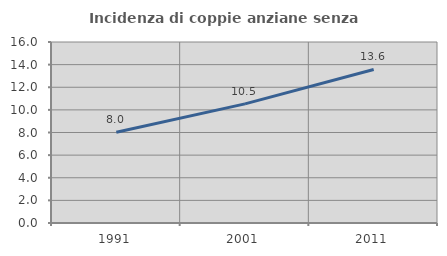
| Category | Incidenza di coppie anziane senza figli  |
|---|---|
| 1991.0 | 8.021 |
| 2001.0 | 10.53 |
| 2011.0 | 13.571 |